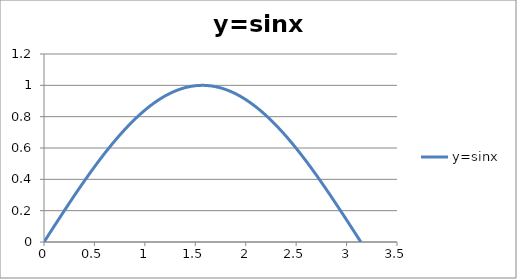
| Category | y=sinx |
|---|---|
| 0.0 | 0 |
| 0.1 | 0.1 |
| 0.2 | 0.199 |
| 0.3 | 0.296 |
| 0.4 | 0.389 |
| 0.5 | 0.479 |
| 0.6 | 0.565 |
| 0.7 | 0.644 |
| 0.8 | 0.717 |
| 0.9 | 0.783 |
| 1.0 | 0.841 |
| 1.1 | 0.891 |
| 1.2 | 0.932 |
| 1.3 | 0.964 |
| 1.4 | 0.985 |
| 1.5 | 0.997 |
| 1.6 | 1 |
| 1.7 | 0.992 |
| 1.8 | 0.974 |
| 1.9 | 0.946 |
| 2.0 | 0.909 |
| 2.1 | 0.863 |
| 2.2 | 0.808 |
| 2.3 | 0.746 |
| 2.4 | 0.675 |
| 2.5 | 0.598 |
| 2.6 | 0.516 |
| 2.7 | 0.427 |
| 2.8 | 0.335 |
| 2.9 | 0.239 |
| 3.0 | 0.141 |
| 3.1 | 0.042 |
| 3.1415 | 0 |